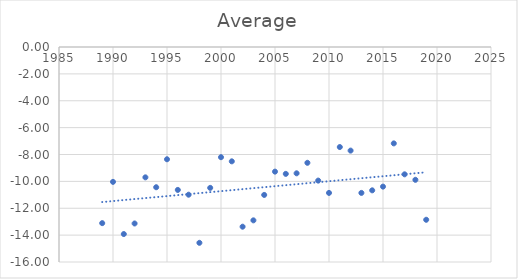
| Category | Average |
|---|---|
| 1989.0 | -13.108 |
| 1990.0 | -10.036 |
| 1991.0 | -13.92 |
| 1992.0 | -13.133 |
| 1993.0 | -9.7 |
| 1994.0 | -10.436 |
| 1995.0 | -8.355 |
| 1996.0 | -10.636 |
| 1997.0 | -10.992 |
| 1998.0 | -14.573 |
| 1999.0 | -10.483 |
| 2000.0 | -8.2 |
| 2001.0 | -8.509 |
| 2002.0 | -13.373 |
| 2003.0 | -12.9 |
| 2004.0 | -11.008 |
| 2005.0 | -9.275 |
| 2006.0 | -9.442 |
| 2007.0 | -9.4 |
| 2008.0 | -8.618 |
| 2009.0 | -9.942 |
| 2010.0 | -10.858 |
| 2011.0 | -7.445 |
| 2012.0 | -7.71 |
| 2013.0 | -10.858 |
| 2014.0 | -10.667 |
| 2015.0 | -10.391 |
| 2016.0 | -7.173 |
| 2017.0 | -9.475 |
| 2018.0 | -9.883 |
| 2019.0 | -12.857 |